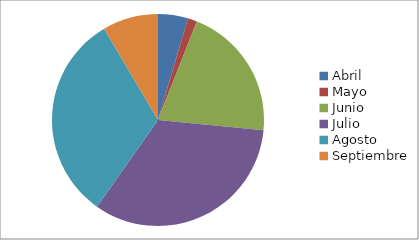
| Category | Series 0 |
|---|---|
| Abril | 1.02 |
| Mayo | 0.313 |
| Junio | 4.587 |
| Julio | 7.419 |
| Agosto | 7.085 |
| Septiembre | 1.891 |